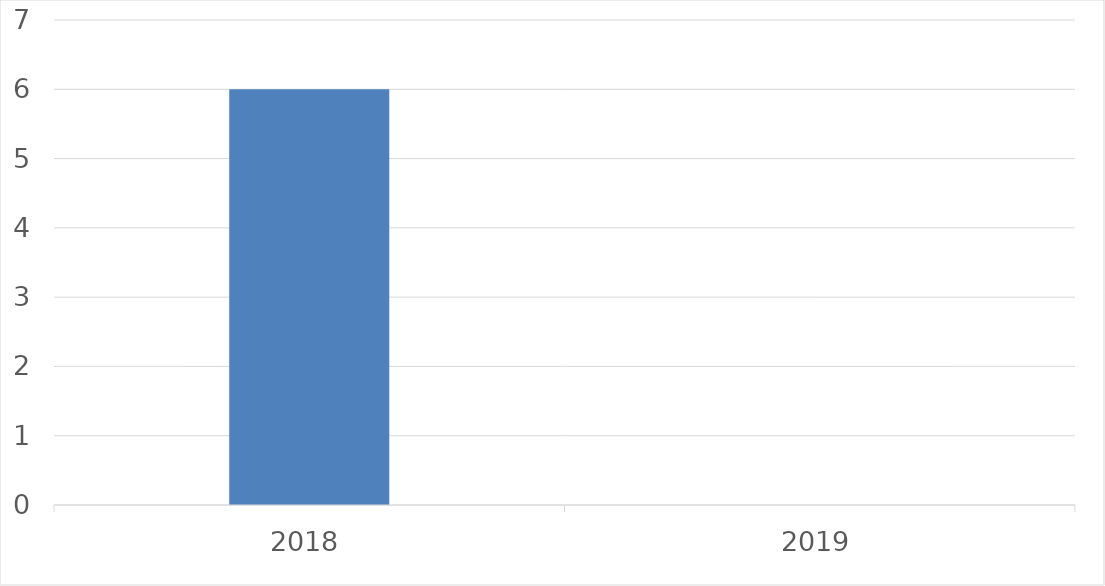
| Category | Series 0 |
|---|---|
| 2018 | 6 |
| 2019 | 0 |